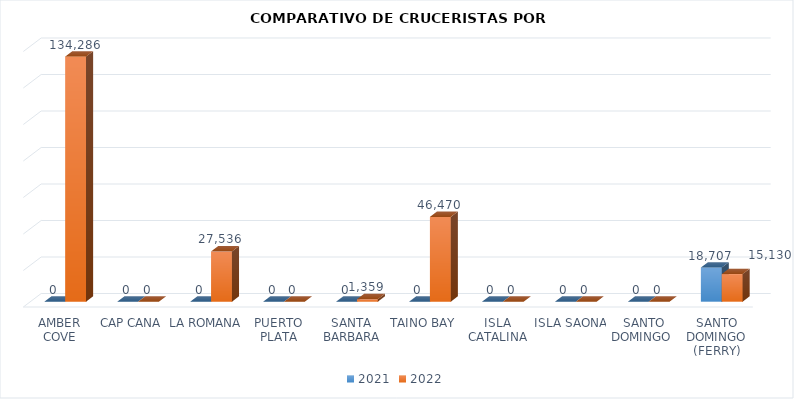
| Category | 2021 | 2022 |
|---|---|---|
| AMBER COVE | 0 | 134286 |
| CAP CANA | 0 | 0 |
| LA ROMANA | 0 | 27536 |
| PUERTO PLATA | 0 | 0 |
| SANTA BARBARA | 0 | 1359 |
| TAINO BAY | 0 | 46470 |
| ISLA CATALINA | 0 | 0 |
| ISLA SAONA | 0 | 0 |
| SANTO DOMINGO  | 0 | 0 |
| SANTO DOMINGO (FERRY) | 18707 | 15130 |